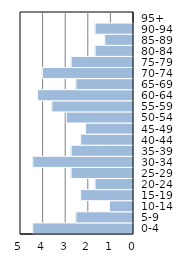
| Category | Series 0 |
|---|---|
| 0-4 | 4.459 |
| 5-9 | 2.548 |
| 10-14 | 1.062 |
| 15-19 | 2.335 |
| 20-24 | 1.699 |
| 25-29 | 2.76 |
| 30-34 | 4.459 |
| 35-39 | 2.76 |
| 40-44 | 2.335 |
| 45-49 | 2.123 |
| 50-54 | 2.972 |
| 55-59 | 3.609 |
| 60-64 | 4.246 |
| 65-69 | 2.548 |
| 70-74 | 4.034 |
| 75-79 | 2.76 |
| 80-84 | 1.699 |
| 85-89 | 1.274 |
| 90-94 | 1.699 |
| 95+ | 0 |